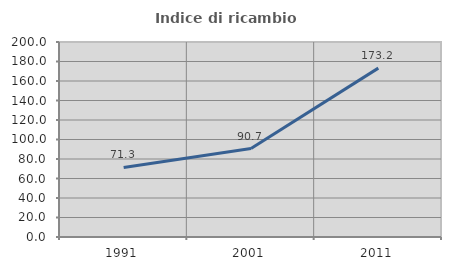
| Category | Indice di ricambio occupazionale  |
|---|---|
| 1991.0 | 71.318 |
| 2001.0 | 90.683 |
| 2011.0 | 173.214 |